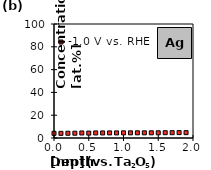
| Category | -1.0 V vs. RHE |
|---|---|
| 0.0 | 4.11 |
| 0.1 | 4.079 |
| 0.2 | 4.156 |
| 0.3 | 4.205 |
| 0.4 | 4.412 |
| 0.5 | 4.291 |
| 0.6 | 4.452 |
| 0.7 | 4.452 |
| 0.80001 | 4.478 |
| 0.9000100000000001 | 4.465 |
| 1.00006 | 4.526 |
| 1.10006 | 4.535 |
| 1.20006 | 4.563 |
| 1.30006 | 4.546 |
| 1.40006 | 4.562 |
| 1.50009 | 4.564 |
| 1.6000899999999998 | 4.659 |
| 1.7000899999999999 | 4.666 |
| 1.80009 | 4.736 |
| 1.9000899999999998 | 4.695 |